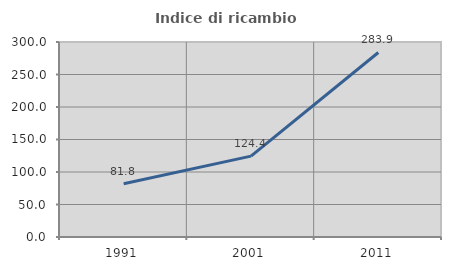
| Category | Indice di ricambio occupazionale  |
|---|---|
| 1991.0 | 81.818 |
| 2001.0 | 124.432 |
| 2011.0 | 283.898 |